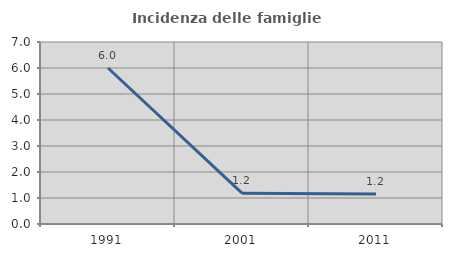
| Category | Incidenza delle famiglie numerose |
|---|---|
| 1991.0 | 6 |
| 2001.0 | 1.184 |
| 2011.0 | 1.152 |